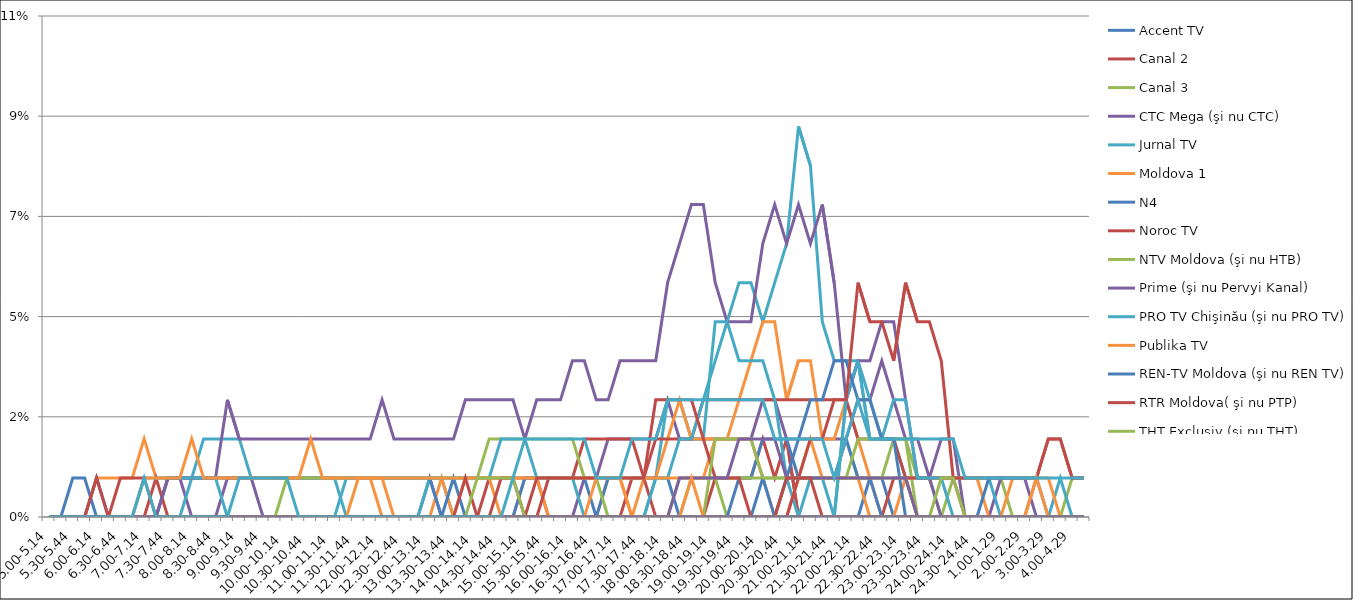
| Category | Accent TV | Canal 2 | Canal 3 | CTC Mega (şi nu CTC) | Jurnal TV | Moldova 1 | N4 | Noroc TV | NTV Moldova (şi nu HTB) | Prime (şi nu Pervyi Kanal) | PRO TV Chişinău (şi nu PRO TV) | Publika TV  | REN-TV Moldova (şi nu REN TV)  | RTR Moldova( şi nu PTP)  | THT Exclusiv (şi nu THT) | TV8 | TVC 21 | TVR MOLDOVA (şi nu TVR) | Canal Regional | Familia Domashniy | ITV | Moldova 2 | Alt canal |
|---|---|---|---|---|---|---|---|---|---|---|---|---|---|---|---|---|---|---|---|---|---|---|---|
| 5.00-5.14 | 0 | 0 | 0 | 0 | 0 | 0 | 0 | 0 | 0 | 0 | 0 | 0 | 0 | 0 | 0 | 0 | 0 | 0 | 0 | 0 | 0 | 0 | 0 |
| 5.15-5.29 | 0 | 0 | 0 | 0 | 0 | 0 | 0 | 0 | 0 | 0 | 0 | 0 | 0 | 0 | 0 | 0 | 0 | 0 | 0 | 0 | 0 | 0 | 0 |
| 5.30-5.44 | 0 | 0 | 0 | 0 | 0 | 0 | 0 | 0 | 0 | 0 | 0 | 0 | 0.009 | 0 | 0 | 0 | 0 | 0 | 0 | 0 | 0 | 0 | 0 |
| 5.45-5.59 | 0 | 0 | 0 | 0 | 0 | 0 | 0 | 0 | 0 | 0 | 0 | 0 | 0.009 | 0 | 0 | 0 | 0 | 0 | 0 | 0 | 0 | 0 | 0 |
| 6.00-6.14 | 0 | 0 | 0 | 0 | 0 | 0.009 | 0.009 | 0 | 0 | 0 | 0 | 0 | 0 | 0.009 | 0 | 0 | 0 | 0 | 0 | 0 | 0 | 0 | 0 |
| 6.15-6.29 | 0 | 0 | 0 | 0 | 0 | 0.009 | 0 | 0 | 0 | 0 | 0 | 0 | 0 | 0 | 0 | 0 | 0 | 0 | 0 | 0 | 0 | 0 | 0 |
| 6.30-6.44 | 0 | 0 | 0 | 0 | 0 | 0.009 | 0 | 0 | 0 | 0 | 0 | 0 | 0 | 0.009 | 0 | 0 | 0 | 0 | 0 | 0 | 0 | 0 | 0 |
| 6.45-6.59 | 0 | 0 | 0 | 0 | 0 | 0.009 | 0 | 0 | 0 | 0 | 0 | 0 | 0 | 0.009 | 0 | 0 | 0 | 0 | 0 | 0 | 0 | 0 | 0 |
| 7.00-7.14 | 0 | 0 | 0 | 0 | 0 | 0.018 | 0 | 0 | 0 | 0 | 0.009 | 0.009 | 0 | 0.009 | 0 | 0 | 0 | 0 | 0 | 0 | 0 | 0 | 0.009 |
| 7.15-7.29 | 0 | 0 | 0 | 0 | 0 | 0.009 | 0 | 0.009 | 0 | 0 | 0.009 | 0.009 | 0 | 0 | 0 | 0 | 0 | 0 | 0 | 0 | 0 | 0 | 0 |
| 7.30-7.44 | 0 | 0 | 0 | 0.009 | 0 | 0.009 | 0.009 | 0 | 0 | 0.009 | 0.009 | 0.009 | 0 | 0 | 0 | 0 | 0 | 0 | 0 | 0 | 0 | 0 | 0 |
| 7.45-7.59 | 0 | 0 | 0 | 0.009 | 0 | 0.009 | 0.009 | 0 | 0 | 0.009 | 0.009 | 0.009 | 0 | 0 | 0 | 0 | 0 | 0 | 0 | 0 | 0 | 0 | 0 |
| 8.00-8.14 | 0 | 0 | 0 | 0 | 0.009 | 0.009 | 0.009 | 0 | 0 | 0.009 | 0.009 | 0.018 | 0 | 0 | 0 | 0 | 0 | 0 | 0 | 0 | 0 | 0 | 0 |
| 8.15-8.29 | 0 | 0 | 0 | 0 | 0.018 | 0.009 | 0.009 | 0 | 0 | 0.009 | 0.009 | 0.009 | 0 | 0 | 0 | 0 | 0 | 0 | 0 | 0 | 0 | 0 | 0 |
| 8.30-8.44 | 0 | 0 | 0 | 0 | 0.018 | 0.009 | 0.009 | 0 | 0 | 0.009 | 0.009 | 0.009 | 0 | 0 | 0 | 0 | 0 | 0 | 0 | 0 | 0 | 0 | 0 |
| 8.45-8.59 | 0 | 0 | 0 | 0.009 | 0.018 | 0.009 | 0.009 | 0 | 0 | 0.026 | 0 | 0.009 | 0 | 0 | 0 | 0 | 0 | 0 | 0 | 0 | 0 | 0 | 0 |
| 9.00-9.14 | 0 | 0 | 0 | 0.009 | 0.018 | 0.009 | 0.009 | 0 | 0 | 0.018 | 0 | 0.009 | 0 | 0 | 0 | 0 | 0 | 0 | 0 | 0 | 0 | 0 | 0.009 |
| 9.15-9.29 | 0 | 0 | 0 | 0.009 | 0.009 | 0.009 | 0.009 | 0 | 0 | 0.018 | 0 | 0.009 | 0 | 0 | 0 | 0 | 0 | 0 | 0 | 0 | 0 | 0 | 0.009 |
| 9.30-9.44 | 0 | 0 | 0 | 0 | 0.009 | 0.009 | 0.009 | 0 | 0 | 0.018 | 0 | 0.009 | 0 | 0 | 0 | 0 | 0 | 0 | 0 | 0 | 0 | 0 | 0.009 |
| 9.45-9.59 | 0 | 0 | 0 | 0 | 0.009 | 0.009 | 0.009 | 0 | 0 | 0.018 | 0 | 0.009 | 0 | 0 | 0 | 0 | 0 | 0 | 0 | 0 | 0 | 0 | 0.009 |
| 10.00-10.14 | 0 | 0 | 0 | 0 | 0.009 | 0.009 | 0.009 | 0 | 0.009 | 0.018 | 0 | 0.009 | 0 | 0 | 0 | 0 | 0 | 0 | 0 | 0 | 0 | 0 | 0.009 |
| 10.15-10.29 | 0 | 0 | 0 | 0 | 0.009 | 0.009 | 0.009 | 0 | 0.009 | 0.018 | 0 | 0.009 | 0 | 0 | 0 | 0 | 0 | 0 | 0 | 0 | 0 | 0 | 0 |
| 10.30-10.44 | 0 | 0 | 0 | 0 | 0.009 | 0.009 | 0.009 | 0 | 0.009 | 0.018 | 0 | 0.018 | 0 | 0 | 0 | 0 | 0 | 0 | 0 | 0 | 0 | 0 | 0 |
| 10.45-10.59 | 0 | 0 | 0 | 0 | 0.009 | 0.009 | 0.009 | 0 | 0.009 | 0.018 | 0 | 0.009 | 0 | 0 | 0 | 0 | 0 | 0 | 0 | 0 | 0 | 0 | 0 |
| 11.00-11.14 | 0 | 0 | 0 | 0 | 0.009 | 0.009 | 0.009 | 0 | 0.009 | 0.018 | 0 | 0.009 | 0 | 0 | 0 | 0 | 0 | 0 | 0 | 0 | 0 | 0 | 0 |
| 11.15-11.29 | 0 | 0 | 0 | 0 | 0 | 0.009 | 0.009 | 0 | 0.009 | 0.018 | 0.009 | 0.009 | 0 | 0 | 0 | 0 | 0 | 0 | 0 | 0 | 0 | 0 | 0 |
| 11.30-11.44 | 0 | 0 | 0 | 0 | 0 | 0.009 | 0.009 | 0 | 0.009 | 0.018 | 0.009 | 0.009 | 0 | 0 | 0 | 0 | 0 | 0.009 | 0 | 0 | 0 | 0 | 0 |
| 11.45-11.59 | 0 | 0 | 0 | 0 | 0 | 0.009 | 0.009 | 0 | 0.009 | 0.018 | 0.009 | 0.009 | 0 | 0 | 0 | 0 | 0 | 0.009 | 0 | 0 | 0 | 0 | 0 |
| 12.00-12.14 | 0 | 0 | 0 | 0 | 0 | 0 | 0.009 | 0 | 0.009 | 0.026 | 0.009 | 0.009 | 0 | 0 | 0 | 0 | 0 | 0.009 | 0 | 0 | 0 | 0 | 0 |
| 12.15-12.29 | 0 | 0 | 0 | 0 | 0 | 0 | 0.009 | 0 | 0.009 | 0.018 | 0.009 | 0.009 | 0 | 0 | 0 | 0 | 0 | 0 | 0 | 0 | 0 | 0 | 0 |
| 12.30-12.44 | 0 | 0 | 0 | 0 | 0 | 0 | 0.009 | 0 | 0.009 | 0.018 | 0.009 | 0.009 | 0 | 0 | 0 | 0 | 0 | 0 | 0 | 0 | 0 | 0 | 0 |
| 12.45-12.59 | 0 | 0 | 0 | 0 | 0 | 0 | 0.009 | 0 | 0.009 | 0.018 | 0.009 | 0.009 | 0 | 0 | 0 | 0 | 0 | 0 | 0 | 0 | 0 | 0 | 0 |
| 13.00-13.14 | 0 | 0 | 0 | 0.009 | 0.009 | 0 | 0.009 | 0 | 0.009 | 0.018 | 0.009 | 0.009 | 0 | 0 | 0 | 0 | 0 | 0 | 0 | 0 | 0 | 0 | 0 |
| 13.15-13.29 | 0 | 0 | 0 | 0 | 0.009 | 0.009 | 0 | 0 | 0.009 | 0.018 | 0.009 | 0.009 | 0 | 0 | 0 | 0 | 0 | 0 | 0 | 0 | 0 | 0 | 0 |
| 13.30-13.44 | 0 | 0 | 0 | 0 | 0 | 0 | 0.009 | 0 | 0.009 | 0.018 | 0.009 | 0.009 | 0 | 0 | 0 | 0 | 0 | 0 | 0 | 0 | 0 | 0 | 0 |
| 13.45-13.59 | 0 | 0 | 0 | 0 | 0 | 0.009 | 0 | 0 | 0.009 | 0.026 | 0.009 | 0.009 | 0 | 0.009 | 0 | 0 | 0 | 0 | 0 | 0 | 0 | 0 | 0 |
| 14.00-14.14 | 0 | 0 | 0 | 0 | 0 | 0.009 | 0 | 0 | 0.009 | 0.026 | 0.009 | 0.009 | 0 | 0 | 0.009 | 0 | 0 | 0 | 0 | 0 | 0 | 0 | 0 |
| 14.15-14.29 | 0 | 0.009 | 0 | 0 | 0 | 0.009 | 0 | 0 | 0.018 | 0.026 | 0.009 | 0.009 | 0 | 0 | 0.009 | 0 | 0 | 0 | 0 | 0 | 0 | 0 | 0 |
| 14.30-14.44 | 0 | 0.009 | 0 | 0 | 0 | 0 | 0 | 0 | 0.018 | 0.026 | 0.018 | 0.009 | 0 | 0.009 | 0.009 | 0 | 0 | 0 | 0 | 0 | 0 | 0 | 0 |
| 14.45-14.59 | 0 | 0.009 | 0 | 0 | 0 | 0 | 0 | 0 | 0.018 | 0.026 | 0.018 | 0.009 | 0 | 0.009 | 0.009 | 0 | 0 | 0 | 0 | 0 | 0 | 0 | 0.009 |
| 15.00-15.14 | 0 | 0.009 | 0 | 0 | 0 | 0.009 | 0.009 | 0 | 0.018 | 0.018 | 0.018 | 0.009 | 0 | 0 | 0 | 0 | 0 | 0 | 0 | 0 | 0 | 0 | 0.018 |
| 15.15-15.29 | 0 | 0.009 | 0 | 0 | 0 | 0.009 | 0.009 | 0 | 0.018 | 0.026 | 0.009 | 0.009 | 0 | 0.009 | 0 | 0 | 0 | 0 | 0 | 0 | 0 | 0 | 0.018 |
| 15.30-15.44 | 0 | 0 | 0 | 0 | 0 | 0 | 0.009 | 0.009 | 0.018 | 0.026 | 0.009 | 0.009 | 0 | 0.009 | 0 | 0 | 0 | 0 | 0 | 0 | 0 | 0 | 0.018 |
| 15.45-15.59 | 0 | 0 | 0 | 0 | 0 | 0 | 0.009 | 0.009 | 0.018 | 0.026 | 0.009 | 0.009 | 0 | 0.009 | 0 | 0 | 0 | 0 | 0 | 0 | 0 | 0 | 0.018 |
| 16.00-16.14 | 0 | 0 | 0 | 0 | 0 | 0 | 0.009 | 0.009 | 0.018 | 0.035 | 0.009 | 0.009 | 0 | 0.009 | 0 | 0 | 0 | 0 | 0 | 0 | 0 | 0 | 0.018 |
| 16.15-16.29 | 0 | 0 | 0 | 0.009 | 0 | 0 | 0.009 | 0.018 | 0.009 | 0.035 | 0 | 0.009 | 0 | 0.009 | 0 | 0 | 0 | 0 | 0 | 0 | 0 | 0 | 0.018 |
| 16.30-16.44 | 0 | 0 | 0 | 0.009 | 0 | 0 | 0 | 0.018 | 0.009 | 0.026 | 0 | 0.009 | 0 | 0.009 | 0 | 0 | 0 | 0.009 | 0 | 0 | 0 | 0 | 0.009 |
| 16.45-16.59 | 0 | 0 | 0 | 0.018 | 0 | 0.009 | 0.009 | 0.018 | 0 | 0.026 | 0 | 0.009 | 0 | 0.009 | 0 | 0 | 0 | 0.009 | 0 | 0 | 0 | 0 | 0.009 |
| 17.00-17.14 | 0 | 0 | 0 | 0.018 | 0 | 0.009 | 0.009 | 0.018 | 0 | 0.035 | 0 | 0.009 | 0 | 0.009 | 0 | 0 | 0 | 0.009 | 0 | 0 | 0 | 0 | 0.009 |
| 17.15-17.29 | 0 | 0.009 | 0 | 0.018 | 0 | 0 | 0.009 | 0.018 | 0 | 0.035 | 0 | 0.009 | 0 | 0.009 | 0 | 0 | 0 | 0 | 0 | 0 | 0 | 0 | 0.018 |
| 17.30-17.44 | 0 | 0.009 | 0 | 0.018 | 0 | 0.009 | 0.009 | 0.009 | 0 | 0.035 | 0 | 0.009 | 0 | 0.009 | 0 | 0 | 0 | 0 | 0 | 0 | 0 | 0 | 0.018 |
| 17.45-17.59 | 0 | 0 | 0 | 0.018 | 0.009 | 0.009 | 0.009 | 0.018 | 0 | 0.035 | 0.009 | 0.009 | 0 | 0.026 | 0 | 0 | 0 | 0 | 0 | 0 | 0 | 0 | 0.018 |
| 18.00-18.14 | 0 | 0 | 0 | 0.026 | 0.026 | 0.018 | 0.009 | 0.018 | 0 | 0.053 | 0.009 | 0.009 | 0 | 0.026 | 0 | 0 | 0 | 0 | 0 | 0 | 0 | 0 | 0.026 |
| 18.15-18.29 | 0 | 0 | 0 | 0.018 | 0.026 | 0.026 | 0 | 0.018 | 0.009 | 0.061 | 0.018 | 0.009 | 0 | 0.026 | 0 | 0.009 | 0 | 0 | 0 | 0 | 0 | 0 | 0.026 |
| 18.30-18.44 | 0 | 0 | 0.009 | 0.018 | 0.018 | 0.018 | 0 | 0.018 | 0.009 | 0.07 | 0.018 | 0.009 | 0 | 0.026 | 0 | 0.009 | 0 | 0.009 | 0 | 0 | 0 | 0 | 0.026 |
| 18.45-18.59 | 0 | 0 | 0.009 | 0.018 | 0.018 | 0.018 | 0 | 0.026 | 0.009 | 0.07 | 0.026 | 0.009 | 0 | 0.018 | 0 | 0.009 | 0 | 0 | 0 | 0 | 0 | 0 | 0.026 |
| 19.00-19.14 | 0 | 0.009 | 0.009 | 0.018 | 0.044 | 0.018 | 0 | 0.026 | 0.009 | 0.053 | 0.035 | 0.018 | 0 | 0.009 | 0.018 | 0.009 | 0 | 0 | 0 | 0 | 0 | 0 | 0.026 |
| 19.15-19.29 | 0 | 0.009 | 0 | 0.018 | 0.044 | 0.018 | 0 | 0.026 | 0.009 | 0.044 | 0.044 | 0.018 | 0 | 0.009 | 0.018 | 0.009 | 0 | 0 | 0 | 0 | 0 | 0 | 0.026 |
| 19.30-19.44 | 0 | 0.009 | 0 | 0.018 | 0.053 | 0.026 | 0.009 | 0.026 | 0.009 | 0.044 | 0.035 | 0.018 | 0 | 0.009 | 0.018 | 0.018 | 0 | 0 | 0 | 0 | 0 | 0 | 0.026 |
| 19.45-19.59 | 0 | 0.009 | 0 | 0.018 | 0.053 | 0.035 | 0.009 | 0.026 | 0.009 | 0.044 | 0.035 | 0.018 | 0 | 0 | 0.018 | 0.018 | 0 | 0 | 0 | 0 | 0 | 0 | 0.026 |
| 20.00-20.14 | 0 | 0.018 | 0 | 0.026 | 0.044 | 0.044 | 0.018 | 0.026 | 0.009 | 0.061 | 0.035 | 0.009 | 0.009 | 0 | 0.009 | 0.018 | 0 | 0 | 0 | 0 | 0 | 0 | 0.026 |
| 20.15-20.29 | 0 | 0.009 | 0 | 0.026 | 0.053 | 0.044 | 0.018 | 0.026 | 0.009 | 0.07 | 0.026 | 0 | 0 | 0 | 0.009 | 0.018 | 0 | 0 | 0 | 0 | 0 | 0 | 0.018 |
| 20.30-20.44 | 0 | 0.018 | 0.009 | 0.018 | 0.061 | 0.026 | 0.018 | 0.026 | 0.009 | 0.061 | 0.009 | 0 | 0.009 | 0 | 0.009 | 0.009 | 0 | 0 | 0 | 0.009 | 0 | 0 | 0.018 |
| 20.45-20.59 | 0 | 0 | 0.009 | 0.018 | 0.088 | 0.035 | 0.009 | 0.026 | 0.009 | 0.07 | 0 | 0.009 | 0.018 | 0.009 | 0.009 | 0.009 | 0 | 0 | 0 | 0.009 | 0 | 0 | 0.018 |
| 21.00-21.14 | 0 | 0 | 0.009 | 0.018 | 0.079 | 0.035 | 0.009 | 0.026 | 0.009 | 0.061 | 0.009 | 0.018 | 0.026 | 0.018 | 0.009 | 0.009 | 0 | 0 | 0 | 0.009 | 0 | 0 | 0.018 |
| 21.15-21.29 | 0 | 0 | 0.009 | 0.018 | 0.044 | 0.018 | 0.009 | 0.026 | 0.009 | 0.07 | 0.009 | 0.009 | 0.026 | 0.018 | 0.009 | 0.009 | 0 | 0 | 0 | 0 | 0 | 0 | 0.018 |
| 21.30-21.44 | 0 | 0 | 0.009 | 0.018 | 0.035 | 0.018 | 0.009 | 0.026 | 0.009 | 0.053 | 0 | 0.009 | 0.035 | 0.026 | 0.009 | 0.009 | 0 | 0 | 0 | 0 | 0 | 0 | 0.009 |
| 21.45-21.59 | 0 | 0 | 0.018 | 0.018 | 0.035 | 0.026 | 0.018 | 0.026 | 0.009 | 0.026 | 0.026 | 0.009 | 0.035 | 0.026 | 0.009 | 0.009 | 0 | 0 | 0 | 0 | 0 | 0 | 0.018 |
| 22.00-22.14 | 0 | 0 | 0.009 | 0.026 | 0.035 | 0.018 | 0.009 | 0.018 | 0.018 | 0.035 | 0.035 | 0.009 | 0.026 | 0.053 | 0.009 | 0.009 | 0 | 0 | 0 | 0 | 0 | 0 | 0.026 |
| 22.15-22.29 | 0.009 | 0 | 0.009 | 0.026 | 0.026 | 0.009 | 0.009 | 0.018 | 0.018 | 0.035 | 0.018 | 0 | 0.026 | 0.044 | 0.009 | 0.009 | 0 | 0 | 0 | 0 | 0 | 0 | 0.018 |
| 22.30-22.44 | 0.009 | 0 | 0.009 | 0.035 | 0.018 | 0 | 0 | 0.018 | 0.018 | 0.044 | 0.018 | 0 | 0.018 | 0.044 | 0.009 | 0.009 | 0 | 0 | 0 | 0 | 0 | 0 | 0.018 |
| 22.45-22.59 | 0 | 0.009 | 0.018 | 0.026 | 0.018 | 0 | 0 | 0.018 | 0.018 | 0.044 | 0.026 | 0 | 0.018 | 0.035 | 0.009 | 0.009 | 0 | 0 | 0 | 0 | 0 | 0 | 0.018 |
| 23.00-23.14 | 0 | 0.009 | 0.018 | 0.018 | 0.009 | 0.009 | 0 | 0.009 | 0.018 | 0.026 | 0.026 | 0 | 0 | 0.053 | 0.009 | 0.009 | 0 | 0 | 0 | 0 | 0 | 0 | 0.018 |
| 23.15-23.29 | 0 | 0 | 0 | 0.018 | 0.009 | 0.009 | 0 | 0.009 | 0.009 | 0.009 | 0.009 | 0 | 0 | 0.044 | 0 | 0 | 0 | 0 | 0 | 0 | 0 | 0 | 0.018 |
| 23.30-23.44 | 0 | 0 | 0 | 0.009 | 0.009 | 0.009 | 0 | 0.009 | 0.009 | 0.009 | 0.009 | 0 | 0 | 0.044 | 0 | 0 | 0 | 0 | 0 | 0 | 0 | 0 | 0.018 |
| 23.45-23.59 | 0 | 0 | 0 | 0.018 | 0.009 | 0.009 | 0 | 0.009 | 0 | 0 | 0.009 | 0 | 0 | 0.035 | 0.009 | 0 | 0 | 0 | 0 | 0 | 0 | 0 | 0.018 |
| 24.00-24.14 | 0 | 0 | 0.009 | 0.018 | 0.009 | 0.009 | 0 | 0.009 | 0 | 0 | 0 | 0 | 0 | 0.009 | 0.009 | 0 | 0 | 0 | 0 | 0 | 0 | 0 | 0.018 |
| 24.15-24.29 | 0 | 0 | 0.009 | 0 | 0.009 | 0.009 | 0 | 0.009 | 0 | 0 | 0 | 0 | 0 | 0 | 0 | 0 | 0 | 0 | 0 | 0 | 0 | 0 | 0.009 |
| 24.30-24.44 | 0 | 0 | 0.009 | 0 | 0.009 | 0.009 | 0 | 0.009 | 0 | 0 | 0 | 0 | 0 | 0 | 0 | 0 | 0 | 0 | 0 | 0 | 0 | 0 | 0.009 |
| 24.45-24.59 | 0 | 0 | 0.009 | 0 | 0.009 | 0 | 0 | 0.009 | 0 | 0 | 0 | 0 | 0.009 | 0 | 0 | 0 | 0 | 0 | 0 | 0 | 0 | 0 | 0.009 |
| 1.00-1.29 | 0 | 0 | 0.009 | 0.009 | 0 | 0 | 0 | 0.009 | 0 | 0 | 0 | 0 | 0.009 | 0 | 0 | 0 | 0 | 0 | 0 | 0 | 0 | 0 | 0.009 |
| 1.30-1. 59 | 0 | 0 | 0 | 0.009 | 0 | 0 | 0 | 0.009 | 0 | 0 | 0 | 0.009 | 0.009 | 0 | 0 | 0 | 0 | 0 | 0 | 0 | 0 | 0 | 0.009 |
| 2.00-2.29 | 0 | 0 | 0 | 0.009 | 0 | 0 | 0 | 0.009 | 0 | 0 | 0 | 0.009 | 0.009 | 0 | 0 | 0 | 0 | 0 | 0 | 0 | 0 | 0 | 0.009 |
| 2.30-2.59 | 0 | 0 | 0 | 0 | 0 | 0 | 0 | 0.009 | 0 | 0 | 0 | 0.009 | 0.009 | 0.009 | 0 | 0 | 0 | 0.009 | 0 | 0 | 0 | 0 | 0.009 |
| 3.00-3.29 | 0 | 0 | 0 | 0 | 0 | 0 | 0 | 0.018 | 0 | 0 | 0 | 0.009 | 0 | 0.018 | 0 | 0 | 0 | 0 | 0 | 0 | 0 | 0 | 0.009 |
| 3.30-3.59 | 0 | 0 | 0 | 0 | 0 | 0 | 0 | 0.018 | 0 | 0 | 0.009 | 0 | 0 | 0.018 | 0 | 0 | 0 | 0 | 0 | 0 | 0 | 0 | 0.009 |
| 4.00-4.29 | 0 | 0 | 0.009 | 0 | 0 | 0 | 0 | 0.009 | 0 | 0 | 0 | 0 | 0 | 0.009 | 0 | 0 | 0 | 0 | 0 | 0 | 0 | 0 | 0.009 |
| 4.30-4.59 | 0 | 0 | 0.009 | 0 | 0 | 0 | 0 | 0.009 | 0 | 0 | 0 | 0 | 0 | 0.009 | 0 | 0 | 0 | 0 | 0 | 0 | 0 | 0 | 0.009 |